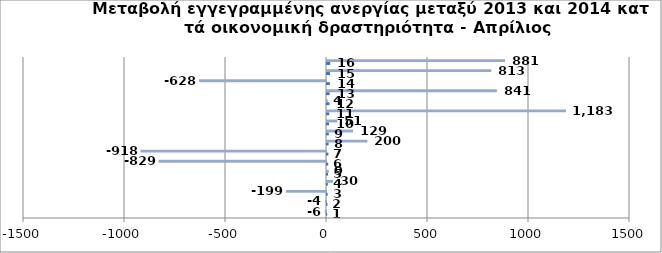
| Category | Series 0 | Series 1 |
|---|---|---|
| 0 | 1 | -6 |
| 1 | 2 | -4 |
| 2 | 3 | -199 |
| 3 | 4 | 30 |
| 4 | 5 | 9 |
| 5 | 6 | -829 |
| 6 | 7 | -918 |
| 7 | 8 | 200 |
| 8 | 9 | 129 |
| 9 | 10 | 51 |
| 10 | 11 | 1183 |
| 11 | 12 | 4 |
| 12 | 13 | 841 |
| 13 | 14 | -628 |
| 14 | 15 | 813 |
| 15 | 16 | 881 |